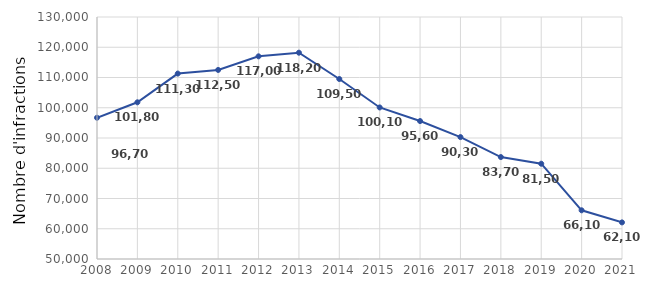
| Category | Series 0 |
|---|---|
| 2008.0 | 96700 |
| 2009.0 | 101800 |
| 2010.0 | 111300 |
| 2011.0 | 112500 |
| 2012.0 | 117000 |
| 2013.0 | 118200 |
| 2014.0 | 109500 |
| 2015.0 | 100100 |
| 2016.0 | 95600 |
| 2017.0 | 90300 |
| 2018.0 | 83700 |
| 2019.0 | 81500 |
| 2020.0 | 66100 |
| 2021.0 | 62100 |